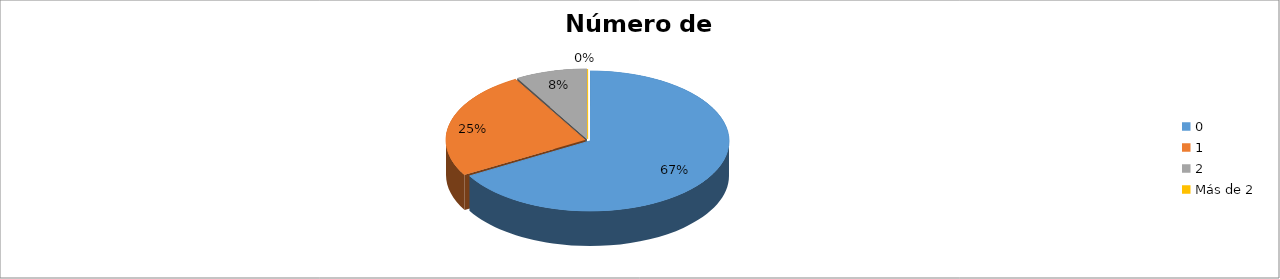
| Category | Series 0 |
|---|---|
| 0 | 0.667 |
| 1 | 0.25 |
| 2 | 0.083 |
| Más de 2 | 0 |